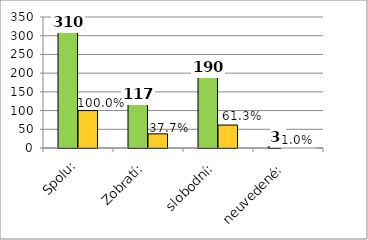
| Category | Series 0 | Series 1 |
|---|---|---|
| Spolu: | 310 | 100 |
| Zobratí: | 117 | 37.742 |
| slobodní: | 190 | 61.29 |
| neuvedené: | 3 | 0.968 |